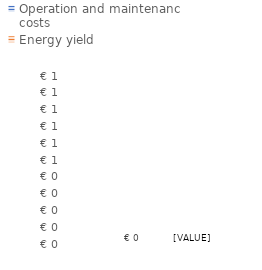
| Category | Operation and maintenance costs | Energy yield |
|---|---|---|
| 0 | 0 | 0 |